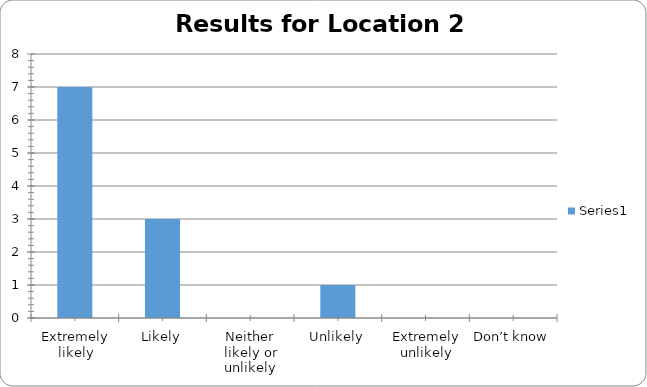
| Category | Series 0 |
|---|---|
| Extremely likely | 7 |
| Likely | 3 |
| Neither likely or unlikely | 0 |
| Unlikely | 1 |
| Extremely unlikely | 0 |
| Don’t know | 0 |